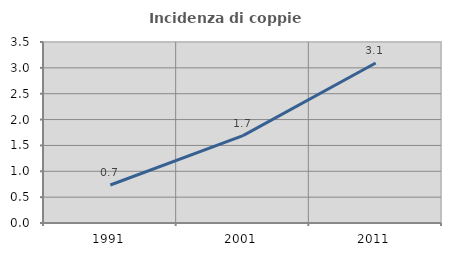
| Category | Incidenza di coppie miste |
|---|---|
| 1991.0 | 0.735 |
| 2001.0 | 1.689 |
| 2011.0 | 3.093 |